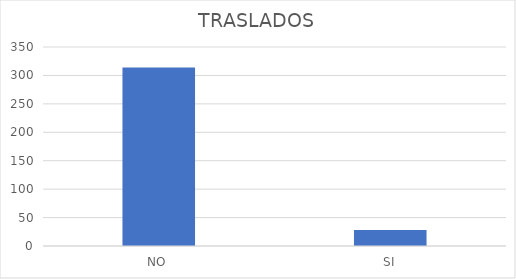
| Category | Series 0 |
|---|---|
| NO | 314 |
| SI | 28 |